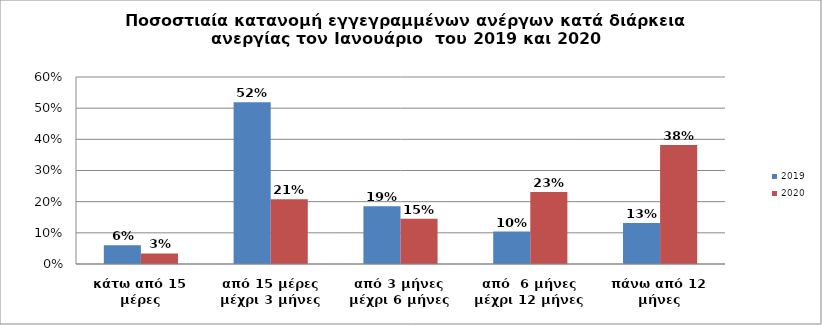
| Category | 2019 | 2020 |
|---|---|---|
| κάτω από 15 μέρες | 0.06 | 0.034 |
| από 15 μέρες μέχρι 3 μήνες | 0.519 | 0.208 |
| από 3 μήνες μέχρι 6 μήνες | 0.185 | 0.146 |
| από  6 μήνες μέχρι 12 μήνες | 0.104 | 0.231 |
| πάνω από 12 μήνες | 0.132 | 0.382 |